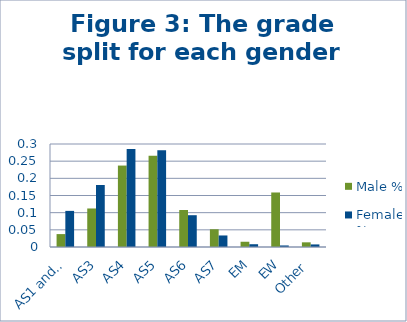
| Category | Male % | Female % |
|---|---|---|
| AS1 and AS22 | 0.038 | 0.105 |
| AS3 | 0.112 | 0.181 |
| AS4 | 0.237 | 0.286 |
| AS5 | 0.266 | 0.282 |
| AS6 | 0.108 | 0.093 |
| AS7 | 0.052 | 0.034 |
| EM | 0.015 | 0.008 |
| EW | 0.159 | 0.004 |
| Other | 0.014 | 0.008 |